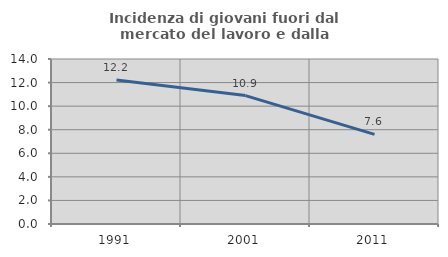
| Category | Incidenza di giovani fuori dal mercato del lavoro e dalla formazione  |
|---|---|
| 1991.0 | 12.214 |
| 2001.0 | 10.896 |
| 2011.0 | 7.6 |